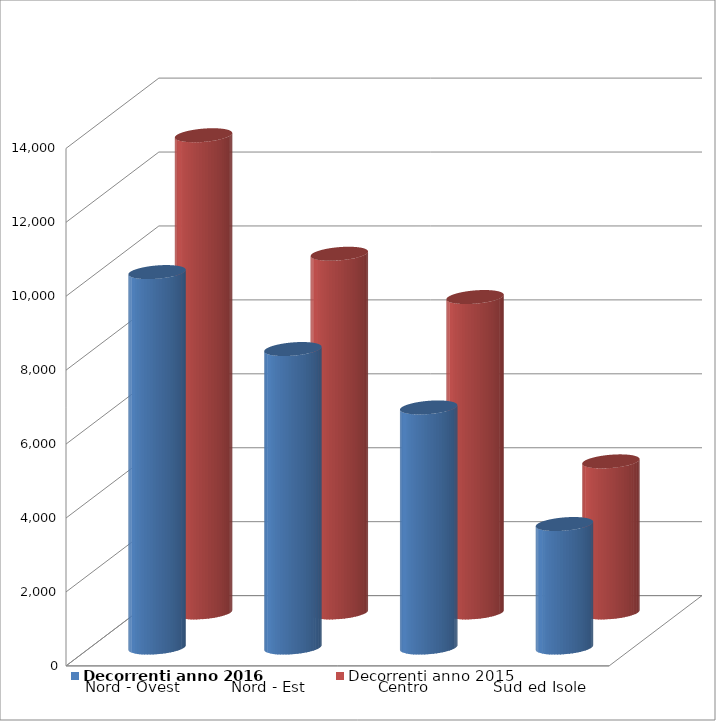
| Category | Decorrenti anno 2016 | Decorrenti anno 2015 |
|---|---|---|
| Nord - Ovest | 10158 | 12909 |
| Nord - Est | 8076 | 9703 |
| Centro | 6496 | 8532 |
| Sud ed Isole | 3342 | 4086 |